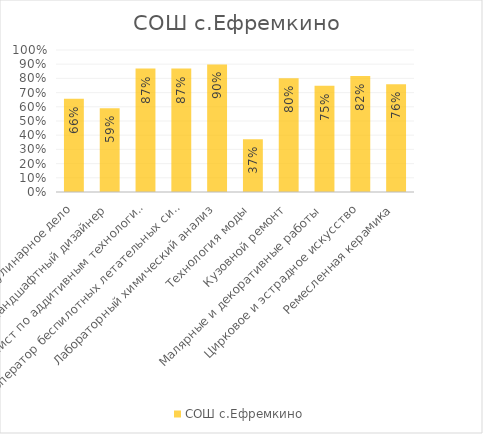
| Category | СОШ с.Ефремкино |
|---|---|
| Кулинарное дело | 0.657 |
| Ландшафтный дизайнер | 0.589 |
| Специалист по аддитивным технологиям | 0.87 |
| Оператор беспилотных летательных систем | 0.87 |
| Лабораторный химический анализ | 0.899 |
| Технология моды | 0.372 |
| Кузовной ремонт | 0.802 |
| Малярные и декоративные работы | 0.749 |
| Цирковое и эстрадное искусство | 0.816 |
| Ремесленная керамика | 0.758 |